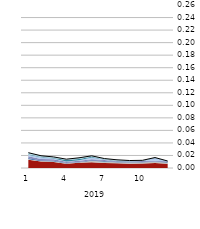
| Category | Systemic Stress Indicator |
|---|---|
| 0 | 0.024 |
| 1 | 0.02 |
| 2 | 0.018 |
| 3 | 0.014 |
| 4 | 0.016 |
| 5 | 0.019 |
| 6 | 0.015 |
| 7 | 0.013 |
| 8 | 0.012 |
| 9 | 0.012 |
| 10 | 0.017 |
| 11 | 0.011 |